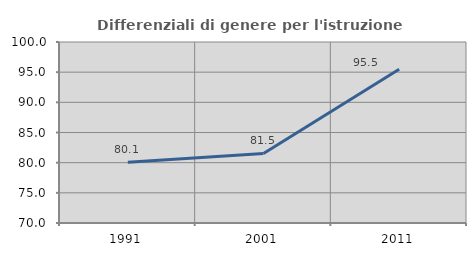
| Category | Differenziali di genere per l'istruzione superiore |
|---|---|
| 1991.0 | 80.064 |
| 2001.0 | 81.535 |
| 2011.0 | 95.49 |